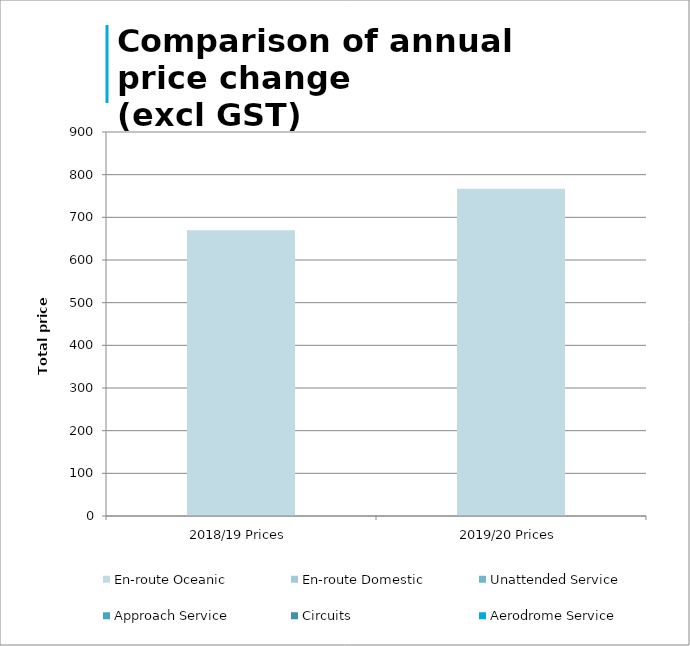
| Category | Aerodrome Service | Circuits | Approach Service | Unattended Service | En-route Domestic | En-route Oceanic |
|---|---|---|---|---|---|---|
| 2018/19 Prices | 0 | 0 | 0 | 0 | 0 | 669.8 |
| 2019/20 Prices | 0 | 0 | 0 | 0 | 0 | 766.89 |